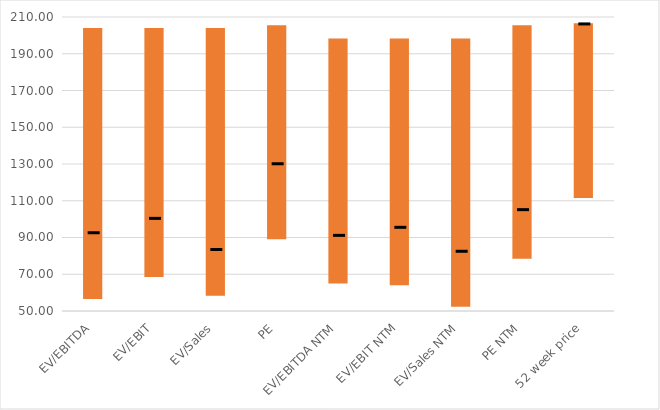
| Category | Low | Range | High |
|---|---|---|---|
| EV/EBITDA | 57.12 | 146.876 | 203.996 |
| EV/EBIT | 69.051 | 134.945 | 203.996 |
| EV/Sales | 58.887 | 145.109 | 203.995 |
| PE | 89.602 | 115.898 | 205.5 |
| EV/EBITDA NTM | 65.533 | 132.719 | 198.252 |
| EV/EBIT NTM | 64.541 | 133.711 | 198.253 |
| EV/Sales NTM | 52.86 | 145.392 | 198.252 |
| PE NTM | 78.975 | 126.525 | 205.5 |
| 52 week price | 112 | 94.6 | 206.6 |